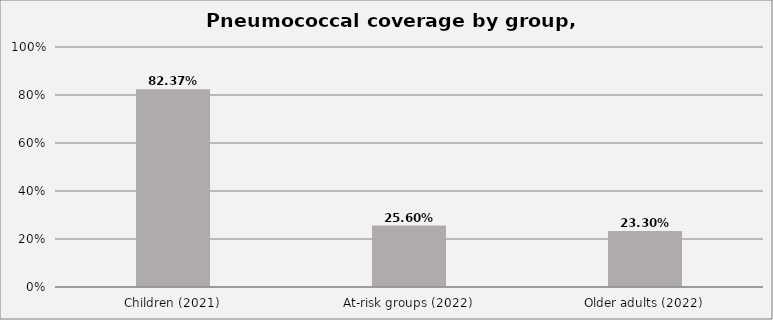
| Category | Series 0 |
|---|---|
| Children (2021) | 0.824 |
| At-risk groups (2022) | 0.256 |
| Older adults (2022) | 0.233 |